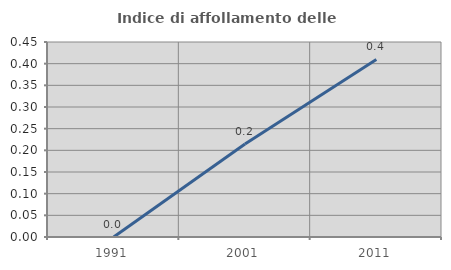
| Category | Indice di affollamento delle abitazioni  |
|---|---|
| 1991.0 | 0 |
| 2001.0 | 0.215 |
| 2011.0 | 0.41 |